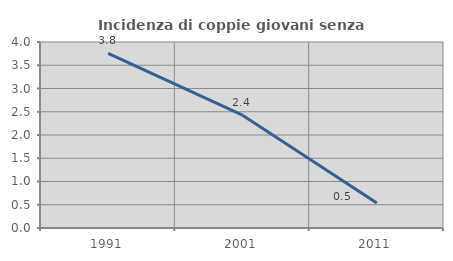
| Category | Incidenza di coppie giovani senza figli |
|---|---|
| 1991.0 | 3.756 |
| 2001.0 | 2.427 |
| 2011.0 | 0.538 |